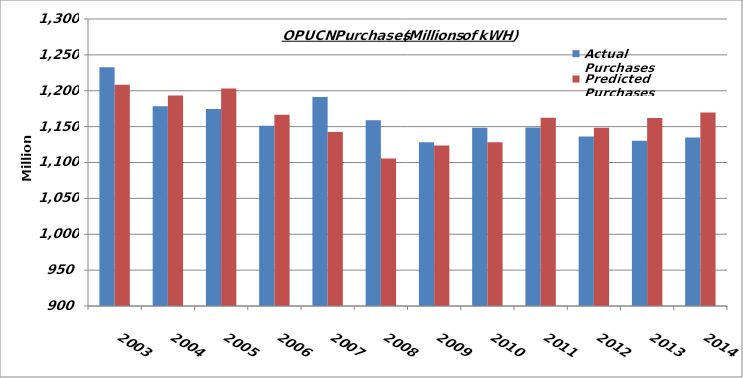
| Category | Actual Purchases | Predicted Purchases |
|---|---|---|
| 2003.0 | 1232724170 | 1208483234.431 |
| 2004.0 | 1178441190 | 1193278221.705 |
| 2005.0 | 1174501350 | 1203281045.231 |
| 2006.0 | 1151360440 | 1166568192.289 |
| 2007.0 | 1191153590 | 1142506607.222 |
| 2008.0 | 1158881926 | 1105605337.874 |
| 2009.0 | 1128390784.511 | 1123816338.212 |
| 2010.0 | 1148489331.815 | 1128203375.007 |
| 2011.0 | 1148632387.395 | 1162405206.249 |
| 2012.0 | 1136211952.671 | 1148412454.467 |
| 2013.0 | 1130407041.667 | 1162091422.851 |
| 2014.0 | 1134970142.773 | 1169512871.293 |